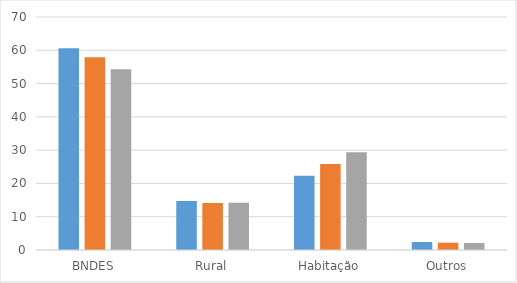
| Category | Series 0 | Series 1 | Series 2 |
|---|---|---|---|
| BNDES | 60.6 | 57.9 | 54.3 |
| Rural | 14.7 | 14.1 | 14.2 |
| Habitação | 22.3 | 25.8 | 29.4 |
| Outros | 2.4 | 2.2 | 2.1 |